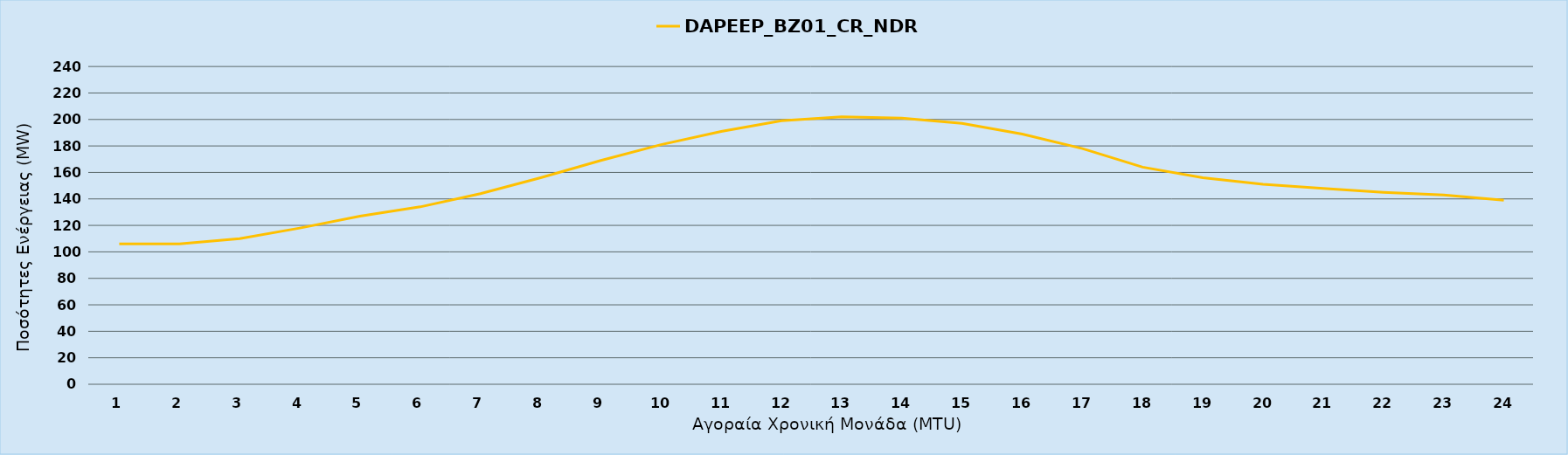
| Category | DAPEEP_BZ01_CR_NDR |
|---|---|
| 0 | 106 |
| 1 | 106 |
| 2 | 110 |
| 3 | 118 |
| 4 | 127 |
| 5 | 134 |
| 6 | 144 |
| 7 | 156 |
| 8 | 169 |
| 9 | 181 |
| 10 | 191 |
| 11 | 199 |
| 12 | 202 |
| 13 | 201 |
| 14 | 197 |
| 15 | 189 |
| 16 | 178 |
| 17 | 164 |
| 18 | 156 |
| 19 | 151 |
| 20 | 148 |
| 21 | 145 |
| 22 | 143 |
| 23 | 139 |